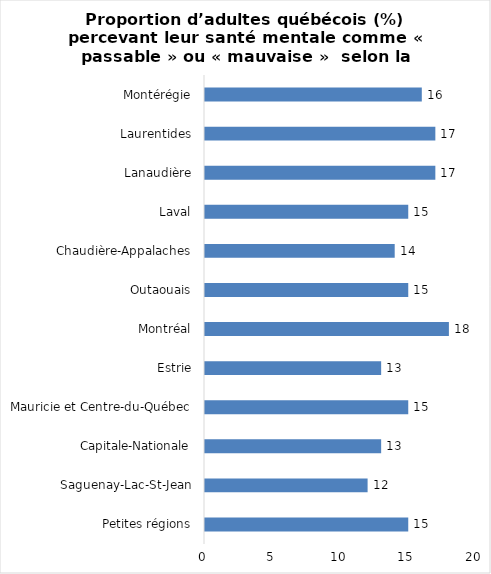
| Category | Series 0 |
|---|---|
| Petites régions | 15 |
| Saguenay-Lac-St-Jean | 12 |
| Capitale-Nationale | 13 |
| Mauricie et Centre-du-Québec | 15 |
| Estrie | 13 |
| Montréal | 18 |
| Outaouais | 15 |
| Chaudière-Appalaches | 14 |
| Laval | 15 |
| Lanaudière | 17 |
| Laurentides | 17 |
| Montérégie | 16 |